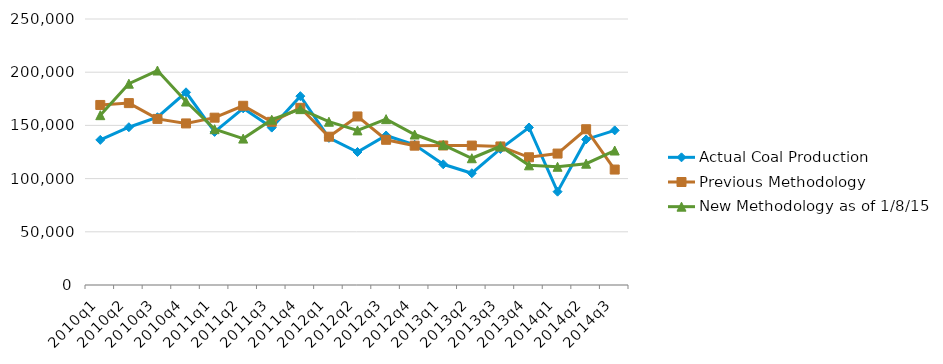
| Category | Actual Coal Production | Previous Methodology | New Methodology as of 1/8/15 |
|---|---|---|---|
| 2010q1 | 136376 | 169207 | 159625 |
| 2010q2 | 148287 | 170936 | 189202 |
| 2010q3 | 157698 | 156104 | 201572 |
| 2010q4 | 181108 | 151851 | 172424 |
| 2011q1 | 143889 | 157259 | 146429 |
| 2011q2 | 166036 | 168434 | 137612 |
| 2011q3 | 147927 | 153358 | 155346 |
| 2011q4 | 177490 | 166529 | 165294 |
| 2012q1 | 138251 | 139389 | 153474 |
| 2012q2 | 125007 | 158406 | 145309 |
| 2012q3 | 140536 | 136483 | 155894 |
| 2012q4 | 131778 | 130950 | 141428 |
| 2013q1 | 113449 | 131112 | 131661 |
| 2013q2 | 105035 | 131040 | 119130 |
| 2013q3 | 127899 | 130206 | 130401 |
| 2013q4 | 148048 | 120037 | 112481 |
| 2014q1 | 87690 | 123527 | 111130 |
| 2014q2 | 136803 | 146395 | 114003 |
| 2014q3 | 145320 | 108501 | 126386 |